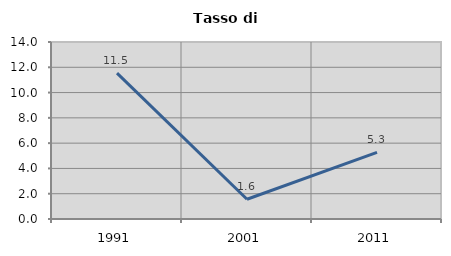
| Category | Tasso di disoccupazione   |
|---|---|
| 1991.0 | 11.538 |
| 2001.0 | 1.562 |
| 2011.0 | 5.263 |